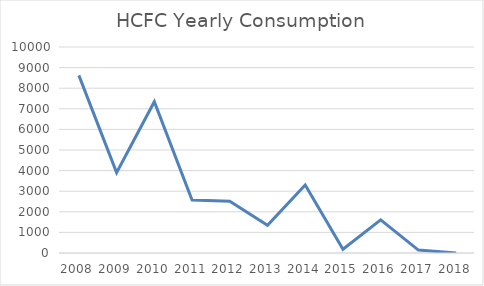
| Category | Series 0 |
|---|---|
| 2008.0 | 8624 |
| 2009.0 | 3900.6 |
| 2010.0 | 7343.6 |
| 2011.0 | 2574 |
| 2012.0 | 2508 |
| 2013.0 | 1342 |
| 2014.0 | 3300 |
| 2015.0 | 180.4 |
| 2016.0 | 1606 |
| 2017.0 | 143 |
| 2018.0 | 0 |